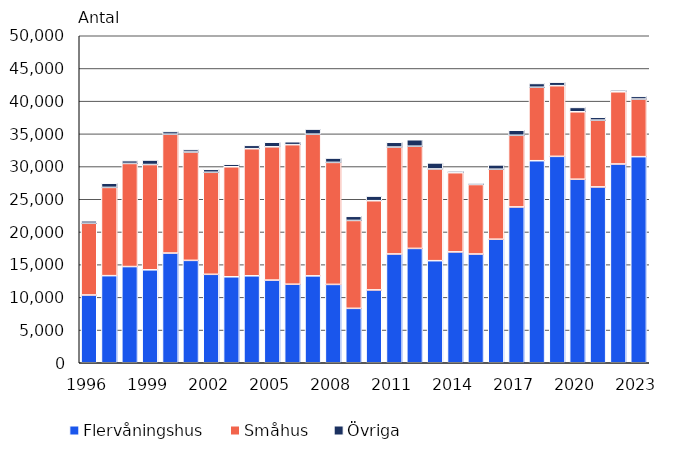
| Category | Flervåningshus | Småhus | Övriga |
|---|---|---|---|
| 1996.0 | 10361 | 10976 | 366 |
| 1997.0 | 13318 | 13493 | 640 |
| 1998.0 | 14708 | 15767 | 425 |
| 1999.0 | 14211 | 16099 | 685 |
| 2000.0 | 16772 | 18173 | 420 |
| 2001.0 | 15655 | 16565 | 378 |
| 2002.0 | 13523 | 15602 | 454 |
| 2003.0 | 13146 | 16822 | 391 |
| 2004.0 | 13296 | 19435 | 513 |
| 2005.0 | 12639 | 20379 | 700 |
| 2006.0 | 12007 | 21340 | 445 |
| 2007.0 | 13287 | 21663 | 776 |
| 2008.0 | 11981 | 18657 | 658 |
| 2009.0 | 8320 | 13442 | 631 |
| 2010.0 | 11140 | 13638 | 704 |
| 2011.0 | 16635 | 16344 | 732 |
| 2012.0 | 17486 | 15623 | 990 |
| 2013.0 | 15607 | 14026 | 920 |
| 2014.0 | 16951 | 12109 | 263 |
| 2015.0 | 16628 | 10625 | 226 |
| 2016.0 | 18890 | 10700 | 660 |
| 2017.0 | 23825 | 10958 | 769 |
| 2018.0 | 30893 | 11232 | 579 |
| 2019.0 | 31559 | 10807 | 537 |
| 2020.0 | 28062 | 10313 | 667 |
| 2021.0 | 26887 | 10211 | 437 |
| 2022.0 | 30392 | 11041 | 277 |
| 2023.0 | 31513 | 8807 | 417 |